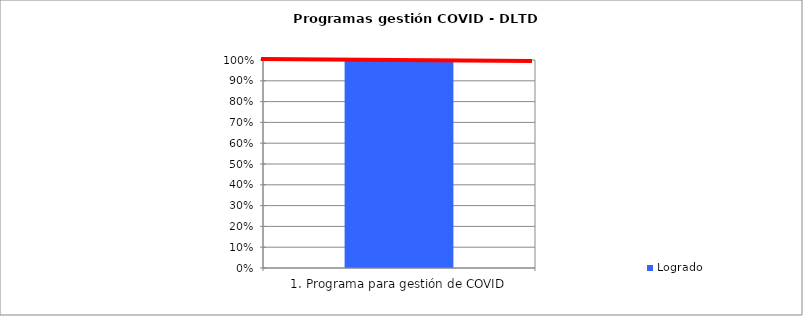
| Category | Logrado  |
|---|---|
| 1. Programa para gestión de COVID | 1 |